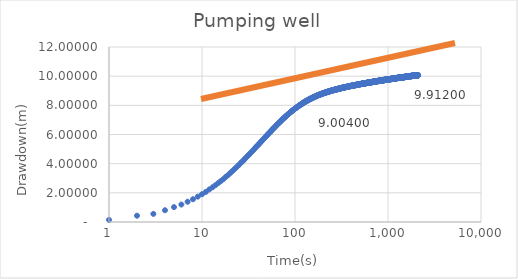
| Category | Series 0 |
|---|---|
| 1.0 | 0.147 |
| 2.0 | 0.43 |
| 3.0 | 0.557 |
| 4.0 | 0.806 |
| 5.0 | 1.02 |
| 6.0 | 1.198 |
| 7.0 | 1.389 |
| 8.0 | 1.561 |
| 9.0 | 1.739 |
| 10.0 | 1.904 |
| 11.0 | 2.062 |
| 12.0 | 2.236 |
| 13.0 | 2.383 |
| 14.0 | 2.53 |
| 15.0 | 2.679 |
| 16.0 | 2.816 |
| 17.0 | 2.945 |
| 18.0 | 3.09 |
| 19.0 | 3.211 |
| 20.0 | 3.342 |
| 21.0 | 3.468 |
| 22.0 | 3.584 |
| 23.0 | 3.702 |
| 24.0 | 3.816 |
| 25.0 | 3.92 |
| 26.0 | 4.038 |
| 27.0 | 4.137 |
| 28.0 | 4.228 |
| 29.0 | 4.341 |
| 30.0 | 4.44 |
| 31.0 | 4.529 |
| 32.0 | 4.618 |
| 33.0 | 4.705 |
| 34.0 | 4.795 |
| 35.0 | 4.876 |
| 36.0 | 4.965 |
| 37.0 | 5.046 |
| 38.0 | 5.131 |
| 39.0 | 5.204 |
| 40.0 | 5.272 |
| 41.0 | 5.35 |
| 42.0 | 5.427 |
| 43.0 | 5.492 |
| 44.0 | 5.569 |
| 45.0 | 5.629 |
| 46.0 | 5.699 |
| 47.0 | 5.764 |
| 48.0 | 5.825 |
| 49.0 | 5.881 |
| 50.0 | 5.948 |
| 51.0 | 6.004 |
| 52.0 | 6.061 |
| 53.0 | 6.117 |
| 54.0 | 6.172 |
| 55.0 | 6.22 |
| 56.0 | 6.278 |
| 57.0 | 6.332 |
| 58.0 | 6.386 |
| 59.0 | 6.431 |
| 60.0 | 6.481 |
| 61.0 | 6.523 |
| 62.0 | 6.565 |
| 63.0 | 6.624 |
| 64.0 | 6.664 |
| 65.0 | 6.704 |
| 66.0 | 6.753 |
| 67.0 | 6.784 |
| 68.0 | 6.828 |
| 69.0 | 6.874 |
| 70.0 | 6.901 |
| 71.0 | 6.939 |
| 72.0 | 6.988 |
| 73.0 | 7.023 |
| 74.0 | 7.059 |
| 75.0 | 7.094 |
| 76.0 | 7.126 |
| 77.0 | 7.164 |
| 78.0 | 7.185 |
| 79.0 | 7.215 |
| 80.0 | 7.263 |
| 81.0 | 7.294 |
| 82.0 | 7.308 |
| 83.0 | 7.347 |
| 84.0 | 7.387 |
| 85.0 | 7.396 |
| 86.0 | 7.433 |
| 87.0 | 7.465 |
| 88.0 | 7.478 |
| 89.0 | 7.521 |
| 90.0 | 7.537 |
| 91.0 | 7.557 |
| 92.0 | 7.598 |
| 93.0 | 7.618 |
| 94.0 | 7.639 |
| 95.0 | 7.664 |
| 96.0 | 7.693 |
| 97.0 | 7.699 |
| 98.0 | 7.723 |
| 99.0 | 7.76 |
| 100.0 | 7.77 |
| 101.0 | 7.797 |
| 102.0 | 7.821 |
| 103.0 | 7.82 |
| 104.0 | 7.85 |
| 105.0 | 7.88 |
| 106.0 | 7.887 |
| 107.0 | 7.905 |
| 108.0 | 7.936 |
| 109.0 | 7.943 |
| 110.0 | 7.967 |
| 111.0 | 7.996 |
| 112.0 | 7.993 |
| 113.0 | 8.001 |
| 114.0 | 8.04 |
| 115.0 | 8.047 |
| 116.0 | 8.055 |
| 117.0 | 8.093 |
| 118.0 | 8.09 |
| 119.0 | 8.096 |
| 120.0 | 8.131 |
| 121.0 | 8.153 |
| 122.0 | 8.147 |
| 123.0 | 8.172 |
| 124.0 | 8.206 |
| 125.0 | 8.187 |
| 126.0 | 8.205 |
| 127.0 | 8.24 |
| 128.0 | 8.243 |
| 129.0 | 8.257 |
| 130.0 | 8.279 |
| 131.0 | 8.259 |
| 132.0 | 8.276 |
| 133.0 | 8.319 |
| 134.0 | 8.314 |
| 135.0 | 8.31 |
| 136.0 | 8.347 |
| 137.0 | 8.346 |
| 138.0 | 8.338 |
| 139.0 | 8.372 |
| 140.0 | 8.394 |
| 141.0 | 8.376 |
| 142.0 | 8.402 |
| 143.0 | 8.427 |
| 144.0 | 8.412 |
| 145.0 | 8.42 |
| 146.0 | 8.461 |
| 147.0 | 8.455 |
| 148.0 | 8.438 |
| 149.0 | 8.476 |
| 150.0 | 8.484 |
| 151.0 | 8.475 |
| 152.0 | 8.493 |
| 153.0 | 8.521 |
| 154.0 | 8.504 |
| 155.0 | 8.515 |
| 156.0 | 8.55 |
| 157.0 | 8.54 |
| 158.0 | 8.535 |
| 159.0 | 8.566 |
| 160.0 | 8.563 |
| 161.0 | 8.553 |
| 162.0 | 8.59 |
| 163.0 | 8.599 |
| 164.0 | 8.578 |
| 165.0 | 8.607 |
| 166.0 | 8.625 |
| 167.0 | 8.608 |
| 168.0 | 8.62 |
| 169.0 | 8.65 |
| 170.0 | 8.631 |
| 171.0 | 8.635 |
| 172.0 | 8.668 |
| 173.0 | 8.663 |
| 174.0 | 8.661 |
| 175.0 | 8.691 |
| 176.0 | 8.687 |
| 177.0 | 8.679 |
| 178.0 | 8.698 |
| 179.0 | 8.713 |
| 180.0 | 8.71 |
| 181.0 | 8.709 |
| 182.0 | 8.728 |
| 183.0 | 8.715 |
| 184.0 | 8.717 |
| 185.0 | 8.752 |
| 186.0 | 8.758 |
| 187.0 | 8.733 |
| 188.0 | 8.749 |
| 189.0 | 8.768 |
| 190.0 | 8.768 |
| 191.0 | 8.767 |
| 192.0 | 8.786 |
| 193.0 | 8.775 |
| 194.0 | 8.774 |
| 195.0 | 8.801 |
| 196.0 | 8.804 |
| 197.0 | 8.794 |
| 198.0 | 8.821 |
| 199.0 | 8.826 |
| 200.0 | 8.805 |
| 201.0 | 8.81 |
| 202.0 | 8.845 |
| 203.0 | 8.838 |
| 204.0 | 8.83 |
| 205.0 | 8.846 |
| 206.0 | 8.846 |
| 207.0 | 8.848 |
| 208.0 | 8.854 |
| 209.0 | 8.876 |
| 210.0 | 8.864 |
| 211.0 | 8.862 |
| 212.0 | 8.88 |
| 213.0 | 8.877 |
| 214.0 | 8.876 |
| 215.0 | 8.881 |
| 216.0 | 8.906 |
| 217.0 | 8.903 |
| 218.0 | 8.889 |
| 219.0 | 8.916 |
| 220.0 | 8.919 |
| 221.0 | 8.897 |
| 222.0 | 8.91 |
| 223.0 | 8.935 |
| 224.0 | 8.932 |
| 225.0 | 8.912 |
| 226.0 | 8.931 |
| 227.0 | 8.94 |
| 228.0 | 8.928 |
| 229.0 | 8.94 |
| 230.0 | 8.954 |
| 231.0 | 8.956 |
| 232.0 | 8.951 |
| 233.0 | 8.954 |
| 234.0 | 8.971 |
| 235.0 | 8.957 |
| 236.0 | 8.96 |
| 237.0 | 8.985 |
| 238.0 | 8.985 |
| 239.0 | 8.972 |
| 240.0 | 8.97 |
| 241.0 | 8.989 |
| 242.0 | 8.987 |
| 243.0 | 8.986 |
| 244.0 | 8.994 |
| 245.0 | 9.001 |
| 246.0 | 9.004 |
| 247.0 | 9.002 |
| 248.0 | 9.015 |
| 249.0 | 9.027 |
| 250.0 | 9.004 |
| 251.0 | 9.015 |
| 252.0 | 9.034 |
| 253.0 | 9.023 |
| 254.0 | 9.027 |
| 255.0 | 9.028 |
| 256.0 | 9.042 |
| 257.0 | 9.032 |
| 258.0 | 9.024 |
| 259.0 | 9.051 |
| 260.0 | 9.053 |
| 261.0 | 9.037 |
| 262.0 | 9.042 |
| 263.0 | 9.056 |
| 264.0 | 9.055 |
| 265.0 | 9.053 |
| 266.0 | 9.067 |
| 267.0 | 9.077 |
| 268.0 | 9.072 |
| 269.0 | 9.054 |
| 270.0 | 9.085 |
| 271.0 | 9.088 |
| 272.0 | 9.069 |
| 273.0 | 9.07 |
| 274.0 | 9.095 |
| 275.0 | 9.084 |
| 276.0 | 9.079 |
| 277.0 | 9.09 |
| 278.0 | 9.109 |
| 279.0 | 9.099 |
| 280.0 | 9.088 |
| 281.0 | 9.104 |
| 282.0 | 9.111 |
| 283.0 | 9.099 |
| 284.0 | 9.104 |
| 285.0 | 9.121 |
| 286.0 | 9.128 |
| 287.0 | 9.109 |
| 288.0 | 9.108 |
| 289.0 | 9.133 |
| 290.0 | 9.131 |
| 291.0 | 9.123 |
| 292.0 | 9.111 |
| 293.0 | 9.139 |
| 294.0 | 9.142 |
| 295.0 | 9.124 |
| 296.0 | 9.13 |
| 297.0 | 9.155 |
| 298.0 | 9.152 |
| 299.0 | 9.14 |
| 300.0 | 9.146 |
| 301.0 | 9.162 |
| 302.0 | 9.154 |
| 303.0 | 9.149 |
| 304.0 | 9.156 |
| 305.0 | 9.166 |
| 306.0 | 9.161 |
| 307.0 | 9.16 |
| 308.0 | 9.169 |
| 309.0 | 9.174 |
| 310.0 | 9.168 |
| 311.0 | 9.163 |
| 312.0 | 9.178 |
| 313.0 | 9.178 |
| 314.0 | 9.17 |
| 315.0 | 9.174 |
| 316.0 | 9.191 |
| 317.0 | 9.195 |
| 318.0 | 9.188 |
| 319.0 | 9.192 |
| 320.0 | 9.201 |
| 321.0 | 9.186 |
| 322.0 | 9.188 |
| 323.0 | 9.208 |
| 324.0 | 9.215 |
| 325.0 | 9.196 |
| 326.0 | 9.201 |
| 327.0 | 9.213 |
| 328.0 | 9.222 |
| 329.0 | 9.208 |
| 330.0 | 9.199 |
| 331.0 | 9.227 |
| 332.0 | 9.22 |
| 333.0 | 9.215 |
| 334.0 | 9.209 |
| 335.0 | 9.233 |
| 336.0 | 9.218 |
| 337.0 | 9.212 |
| 338.0 | 9.236 |
| 339.0 | 9.24 |
| 340.0 | 9.224 |
| 341.0 | 9.222 |
| 342.0 | 9.24 |
| 343.0 | 9.248 |
| 344.0 | 9.229 |
| 345.0 | 9.225 |
| 346.0 | 9.256 |
| 347.0 | 9.246 |
| 348.0 | 9.236 |
| 349.0 | 9.243 |
| 350.0 | 9.253 |
| 351.0 | 9.254 |
| 352.0 | 9.248 |
| 353.0 | 9.254 |
| 354.0 | 9.266 |
| 355.0 | 9.258 |
| 356.0 | 9.254 |
| 357.0 | 9.264 |
| 358.0 | 9.264 |
| 359.0 | 9.262 |
| 360.0 | 9.253 |
| 361.0 | 9.274 |
| 362.0 | 9.279 |
| 363.0 | 9.27 |
| 364.0 | 9.266 |
| 365.0 | 9.284 |
| 366.0 | 9.282 |
| 367.0 | 9.269 |
| 368.0 | 9.263 |
| 369.0 | 9.29 |
| 370.0 | 9.283 |
| 371.0 | 9.282 |
| 372.0 | 9.274 |
| 373.0 | 9.295 |
| 374.0 | 9.296 |
| 375.0 | 9.283 |
| 376.0 | 9.286 |
| 377.0 | 9.301 |
| 378.0 | 9.308 |
| 379.0 | 9.294 |
| 380.0 | 9.299 |
| 381.0 | 9.315 |
| 382.0 | 9.315 |
| 383.0 | 9.302 |
| 384.0 | 9.308 |
| 385.0 | 9.324 |
| 386.0 | 9.314 |
| 387.0 | 9.298 |
| 388.0 | 9.31 |
| 389.0 | 9.318 |
| 390.0 | 9.317 |
| 391.0 | 9.308 |
| 392.0 | 9.322 |
| 393.0 | 9.325 |
| 394.0 | 9.325 |
| 395.0 | 9.318 |
| 396.0 | 9.318 |
| 397.0 | 9.333 |
| 398.0 | 9.338 |
| 399.0 | 9.323 |
| 400.0 | 9.332 |
| 401.0 | 9.346 |
| 402.0 | 9.33 |
| 403.0 | 9.325 |
| 404.0 | 9.327 |
| 405.0 | 9.339 |
| 406.0 | 9.343 |
| 407.0 | 9.336 |
| 408.0 | 9.332 |
| 409.0 | 9.342 |
| 410.0 | 9.351 |
| 411.0 | 9.337 |
| 412.0 | 9.335 |
| 413.0 | 9.358 |
| 414.0 | 9.355 |
| 415.0 | 9.339 |
| 416.0 | 9.332 |
| 417.0 | 9.358 |
| 418.0 | 9.371 |
| 419.0 | 9.346 |
| 420.0 | 9.355 |
| 421.0 | 9.366 |
| 422.0 | 9.359 |
| 423.0 | 9.355 |
| 424.0 | 9.352 |
| 425.0 | 9.377 |
| 426.0 | 9.374 |
| 427.0 | 9.356 |
| 428.0 | 9.365 |
| 429.0 | 9.378 |
| 430.0 | 9.383 |
| 431.0 | 9.361 |
| 432.0 | 9.363 |
| 433.0 | 9.38 |
| 434.0 | 9.374 |
| 435.0 | 9.37 |
| 436.0 | 9.369 |
| 437.0 | 9.393 |
| 438.0 | 9.386 |
| 439.0 | 9.378 |
| 440.0 | 9.369 |
| 441.0 | 9.397 |
| 442.0 | 9.39 |
| 443.0 | 9.374 |
| 444.0 | 9.394 |
| 445.0 | 9.397 |
| 446.0 | 9.397 |
| 447.0 | 9.388 |
| 448.0 | 9.385 |
| 449.0 | 9.398 |
| 450.0 | 9.398 |
| 451.0 | 9.382 |
| 452.0 | 9.392 |
| 453.0 | 9.398 |
| 454.0 | 9.41 |
| 455.0 | 9.396 |
| 456.0 | 9.399 |
| 457.0 | 9.4 |
| 458.0 | 9.415 |
| 459.0 | 9.407 |
| 460.0 | 9.392 |
| 461.0 | 9.404 |
| 462.0 | 9.414 |
| 463.0 | 9.415 |
| 464.0 | 9.411 |
| 465.0 | 9.412 |
| 466.0 | 9.417 |
| 467.0 | 9.435 |
| 468.0 | 9.411 |
| 469.0 | 9.406 |
| 470.0 | 9.414 |
| 471.0 | 9.419 |
| 472.0 | 9.426 |
| 473.0 | 9.421 |
| 474.0 | 9.419 |
| 475.0 | 9.435 |
| 476.0 | 9.422 |
| 477.0 | 9.407 |
| 478.0 | 9.427 |
| 479.0 | 9.433 |
| 480.0 | 9.437 |
| 481.0 | 9.426 |
| 482.0 | 9.425 |
| 483.0 | 9.435 |
| 484.0 | 9.438 |
| 485.0 | 9.435 |
| 486.0 | 9.428 |
| 487.0 | 9.437 |
| 488.0 | 9.445 |
| 489.0 | 9.439 |
| 490.0 | 9.443 |
| 491.0 | 9.443 |
| 492.0 | 9.452 |
| 493.0 | 9.46 |
| 494.0 | 9.442 |
| 495.0 | 9.442 |
| 496.0 | 9.453 |
| 497.0 | 9.452 |
| 498.0 | 9.446 |
| 499.0 | 9.45 |
| 500.0 | 9.449 |
| 501.0 | 9.46 |
| 502.0 | 9.454 |
| 503.0 | 9.448 |
| 504.0 | 9.457 |
| 505.0 | 9.458 |
| 506.0 | 9.453 |
| 507.0 | 9.455 |
| 508.0 | 9.453 |
| 509.0 | 9.466 |
| 510.0 | 9.465 |
| 511.0 | 9.458 |
| 512.0 | 9.455 |
| 513.0 | 9.47 |
| 514.0 | 9.471 |
| 515.0 | 9.465 |
| 516.0 | 9.456 |
| 517.0 | 9.476 |
| 518.0 | 9.477 |
| 519.0 | 9.46 |
| 520.0 | 9.457 |
| 521.0 | 9.47 |
| 522.0 | 9.481 |
| 523.0 | 9.475 |
| 524.0 | 9.462 |
| 525.0 | 9.478 |
| 526.0 | 9.495 |
| 527.0 | 9.487 |
| 528.0 | 9.474 |
| 529.0 | 9.475 |
| 530.0 | 9.482 |
| 531.0 | 9.489 |
| 532.0 | 9.483 |
| 533.0 | 9.48 |
| 534.0 | 9.491 |
| 535.0 | 9.495 |
| 536.0 | 9.487 |
| 537.0 | 9.482 |
| 538.0 | 9.494 |
| 539.0 | 9.492 |
| 540.0 | 9.497 |
| 541.0 | 9.486 |
| 542.0 | 9.479 |
| 543.0 | 9.495 |
| 544.0 | 9.502 |
| 545.0 | 9.503 |
| 546.0 | 9.485 |
| 547.0 | 9.5 |
| 548.0 | 9.504 |
| 549.0 | 9.505 |
| 550.0 | 9.49 |
| 551.0 | 9.487 |
| 552.0 | 9.51 |
| 553.0 | 9.513 |
| 554.0 | 9.508 |
| 555.0 | 9.499 |
| 556.0 | 9.512 |
| 557.0 | 9.52 |
| 558.0 | 9.509 |
| 559.0 | 9.505 |
| 560.0 | 9.513 |
| 561.0 | 9.518 |
| 562.0 | 9.502 |
| 563.0 | 9.499 |
| 564.0 | 9.514 |
| 565.0 | 9.519 |
| 566.0 | 9.511 |
| 567.0 | 9.513 |
| 568.0 | 9.505 |
| 569.0 | 9.518 |
| 570.0 | 9.528 |
| 571.0 | 9.509 |
| 572.0 | 9.514 |
| 573.0 | 9.52 |
| 574.0 | 9.531 |
| 575.0 | 9.518 |
| 576.0 | 9.513 |
| 577.0 | 9.529 |
| 578.0 | 9.527 |
| 579.0 | 9.526 |
| 580.0 | 9.53 |
| 581.0 | 9.525 |
| 582.0 | 9.531 |
| 583.0 | 9.531 |
| 584.0 | 9.524 |
| 585.0 | 9.516 |
| 586.0 | 9.531 |
| 587.0 | 9.541 |
| 588.0 | 9.534 |
| 589.0 | 9.529 |
| 590.0 | 9.526 |
| 591.0 | 9.543 |
| 592.0 | 9.549 |
| 593.0 | 9.526 |
| 594.0 | 9.532 |
| 595.0 | 9.538 |
| 596.0 | 9.546 |
| 597.0 | 9.542 |
| 598.0 | 9.534 |
| 599.0 | 9.538 |
| 600.0 | 9.552 |
| 601.0 | 9.546 |
| 602.0 | 9.537 |
| 603.0 | 9.53 |
| 604.0 | 9.549 |
| 605.0 | 9.56 |
| 606.0 | 9.547 |
| 607.0 | 9.544 |
| 608.0 | 9.542 |
| 609.0 | 9.563 |
| 610.0 | 9.556 |
| 611.0 | 9.544 |
| 612.0 | 9.546 |
| 613.0 | 9.558 |
| 614.0 | 9.566 |
| 615.0 | 9.546 |
| 616.0 | 9.543 |
| 617.0 | 9.552 |
| 618.0 | 9.565 |
| 619.0 | 9.564 |
| 620.0 | 9.551 |
| 621.0 | 9.56 |
| 622.0 | 9.565 |
| 623.0 | 9.575 |
| 624.0 | 9.562 |
| 625.0 | 9.558 |
| 626.0 | 9.573 |
| 627.0 | 9.575 |
| 628.0 | 9.557 |
| 629.0 | 9.556 |
| 630.0 | 9.575 |
| 631.0 | 9.57 |
| 632.0 | 9.568 |
| 633.0 | 9.555 |
| 634.0 | 9.564 |
| 635.0 | 9.579 |
| 636.0 | 9.573 |
| 637.0 | 9.559 |
| 638.0 | 9.559 |
| 639.0 | 9.574 |
| 640.0 | 9.579 |
| 641.0 | 9.578 |
| 642.0 | 9.562 |
| 643.0 | 9.576 |
| 644.0 | 9.582 |
| 645.0 | 9.592 |
| 646.0 | 9.57 |
| 647.0 | 9.566 |
| 648.0 | 9.582 |
| 649.0 | 9.585 |
| 650.0 | 9.584 |
| 651.0 | 9.57 |
| 652.0 | 9.569 |
| 653.0 | 9.591 |
| 654.0 | 9.59 |
| 655.0 | 9.576 |
| 656.0 | 9.577 |
| 657.0 | 9.587 |
| 658.0 | 9.604 |
| 659.0 | 9.581 |
| 660.0 | 9.577 |
| 661.0 | 9.586 |
| 662.0 | 9.589 |
| 663.0 | 9.607 |
| 664.0 | 9.588 |
| 665.0 | 9.582 |
| 666.0 | 9.6 |
| 667.0 | 9.595 |
| 668.0 | 9.589 |
| 669.0 | 9.586 |
| 670.0 | 9.59 |
| 671.0 | 9.601 |
| 672.0 | 9.598 |
| 673.0 | 9.585 |
| 674.0 | 9.588 |
| 675.0 | 9.608 |
| 676.0 | 9.604 |
| 677.0 | 9.601 |
| 678.0 | 9.595 |
| 679.0 | 9.611 |
| 680.0 | 9.607 |
| 681.0 | 9.596 |
| 682.0 | 9.595 |
| 683.0 | 9.604 |
| 684.0 | 9.614 |
| 685.0 | 9.608 |
| 686.0 | 9.601 |
| 687.0 | 9.61 |
| 688.0 | 9.613 |
| 689.0 | 9.614 |
| 690.0 | 9.601 |
| 691.0 | 9.61 |
| 692.0 | 9.622 |
| 693.0 | 9.618 |
| 694.0 | 9.609 |
| 695.0 | 9.614 |
| 696.0 | 9.621 |
| 697.0 | 9.629 |
| 698.0 | 9.614 |
| 699.0 | 9.612 |
| 700.0 | 9.607 |
| 701.0 | 9.627 |
| 702.0 | 9.62 |
| 703.0 | 9.608 |
| 704.0 | 9.615 |
| 705.0 | 9.636 |
| 706.0 | 9.631 |
| 707.0 | 9.622 |
| 708.0 | 9.607 |
| 709.0 | 9.616 |
| 710.0 | 9.634 |
| 711.0 | 9.634 |
| 712.0 | 9.618 |
| 713.0 | 9.624 |
| 714.0 | 9.634 |
| 715.0 | 9.628 |
| 716.0 | 9.62 |
| 717.0 | 9.62 |
| 718.0 | 9.635 |
| 719.0 | 9.638 |
| 720.0 | 9.628 |
| 721.0 | 9.616 |
| 722.0 | 9.623 |
| 723.0 | 9.646 |
| 724.0 | 9.642 |
| 725.0 | 9.619 |
| 726.0 | 9.625 |
| 727.0 | 9.642 |
| 728.0 | 9.641 |
| 729.0 | 9.627 |
| 730.0 | 9.624 |
| 731.0 | 9.639 |
| 732.0 | 9.655 |
| 733.0 | 9.649 |
| 734.0 | 9.633 |
| 735.0 | 9.643 |
| 736.0 | 9.645 |
| 737.0 | 9.647 |
| 738.0 | 9.635 |
| 739.0 | 9.628 |
| 740.0 | 9.643 |
| 741.0 | 9.66 |
| 742.0 | 9.649 |
| 743.0 | 9.636 |
| 744.0 | 9.647 |
| 745.0 | 9.653 |
| 746.0 | 9.65 |
| 747.0 | 9.636 |
| 748.0 | 9.642 |
| 749.0 | 9.653 |
| 750.0 | 9.657 |
| 751.0 | 9.647 |
| 752.0 | 9.642 |
| 753.0 | 9.658 |
| 754.0 | 9.656 |
| 755.0 | 9.652 |
| 756.0 | 9.654 |
| 757.0 | 9.654 |
| 758.0 | 9.671 |
| 759.0 | 9.66 |
| 760.0 | 9.639 |
| 761.0 | 9.652 |
| 762.0 | 9.664 |
| 763.0 | 9.659 |
| 764.0 | 9.658 |
| 765.0 | 9.653 |
| 766.0 | 9.664 |
| 767.0 | 9.67 |
| 768.0 | 9.657 |
| 769.0 | 9.647 |
| 770.0 | 9.662 |
| 771.0 | 9.668 |
| 772.0 | 9.662 |
| 773.0 | 9.657 |
| 774.0 | 9.657 |
| 775.0 | 9.673 |
| 776.0 | 9.672 |
| 777.0 | 9.662 |
| 778.0 | 9.665 |
| 779.0 | 9.671 |
| 780.0 | 9.68 |
| 781.0 | 9.666 |
| 782.0 | 9.665 |
| 783.0 | 9.663 |
| 784.0 | 9.678 |
| 785.0 | 9.672 |
| 786.0 | 9.666 |
| 787.0 | 9.664 |
| 788.0 | 9.674 |
| 789.0 | 9.68 |
| 790.0 | 9.673 |
| 791.0 | 9.662 |
| 792.0 | 9.68 |
| 793.0 | 9.682 |
| 794.0 | 9.678 |
| 795.0 | 9.667 |
| 796.0 | 9.67 |
| 797.0 | 9.68 |
| 798.0 | 9.684 |
| 799.0 | 9.674 |
| 800.0 | 9.664 |
| 801.0 | 9.692 |
| 802.0 | 9.686 |
| 803.0 | 9.673 |
| 804.0 | 9.67 |
| 805.0 | 9.681 |
| 806.0 | 9.703 |
| 807.0 | 9.682 |
| 808.0 | 9.672 |
| 809.0 | 9.689 |
| 810.0 | 9.697 |
| 811.0 | 9.696 |
| 812.0 | 9.675 |
| 813.0 | 9.677 |
| 814.0 | 9.69 |
| 815.0 | 9.69 |
| 816.0 | 9.678 |
| 817.0 | 9.678 |
| 818.0 | 9.695 |
| 819.0 | 9.694 |
| 820.0 | 9.694 |
| 821.0 | 9.685 |
| 822.0 | 9.695 |
| 823.0 | 9.697 |
| 824.0 | 9.704 |
| 825.0 | 9.693 |
| 826.0 | 9.688 |
| 827.0 | 9.704 |
| 828.0 | 9.705 |
| 829.0 | 9.688 |
| 830.0 | 9.683 |
| 831.0 | 9.694 |
| 832.0 | 9.716 |
| 833.0 | 9.708 |
| 834.0 | 9.69 |
| 835.0 | 9.695 |
| 836.0 | 9.708 |
| 837.0 | 9.713 |
| 838.0 | 9.696 |
| 839.0 | 9.692 |
| 840.0 | 9.708 |
| 841.0 | 9.707 |
| 842.0 | 9.704 |
| 843.0 | 9.693 |
| 844.0 | 9.693 |
| 845.0 | 9.711 |
| 846.0 | 9.71 |
| 847.0 | 9.692 |
| 848.0 | 9.696 |
| 849.0 | 9.703 |
| 850.0 | 9.716 |
| 851.0 | 9.707 |
| 852.0 | 9.7 |
| 853.0 | 9.705 |
| 854.0 | 9.72 |
| 855.0 | 9.719 |
| 856.0 | 9.707 |
| 857.0 | 9.705 |
| 858.0 | 9.719 |
| 859.0 | 9.714 |
| 860.0 | 9.7 |
| 861.0 | 9.701 |
| 862.0 | 9.719 |
| 863.0 | 9.725 |
| 864.0 | 9.71 |
| 865.0 | 9.704 |
| 866.0 | 9.71 |
| 867.0 | 9.715 |
| 868.0 | 9.716 |
| 869.0 | 9.699 |
| 870.0 | 9.716 |
| 871.0 | 9.723 |
| 872.0 | 9.719 |
| 873.0 | 9.709 |
| 874.0 | 9.719 |
| 875.0 | 9.728 |
| 876.0 | 9.721 |
| 877.0 | 9.715 |
| 878.0 | 9.719 |
| 879.0 | 9.727 |
| 880.0 | 9.722 |
| 881.0 | 9.714 |
| 882.0 | 9.712 |
| 883.0 | 9.732 |
| 884.0 | 9.734 |
| 885.0 | 9.721 |
| 886.0 | 9.708 |
| 887.0 | 9.721 |
| 888.0 | 9.74 |
| 889.0 | 9.728 |
| 890.0 | 9.714 |
| 891.0 | 9.728 |
| 892.0 | 9.734 |
| 893.0 | 9.732 |
| 894.0 | 9.722 |
| 895.0 | 9.718 |
| 896.0 | 9.738 |
| 897.0 | 9.75 |
| 898.0 | 9.733 |
| 899.0 | 9.725 |
| 900.0 | 9.737 |
| 901.0 | 9.739 |
| 902.0 | 9.731 |
| 903.0 | 9.711 |
| 904.0 | 9.732 |
| 905.0 | 9.749 |
| 906.0 | 9.737 |
| 907.0 | 9.733 |
| 908.0 | 9.731 |
| 909.0 | 9.742 |
| 910.0 | 9.742 |
| 911.0 | 9.726 |
| 912.0 | 9.722 |
| 913.0 | 9.746 |
| 914.0 | 9.751 |
| 915.0 | 9.735 |
| 916.0 | 9.731 |
| 917.0 | 9.741 |
| 918.0 | 9.752 |
| 919.0 | 9.746 |
| 920.0 | 9.728 |
| 921.0 | 9.748 |
| 922.0 | 9.744 |
| 923.0 | 9.741 |
| 924.0 | 9.74 |
| 925.0 | 9.733 |
| 926.0 | 9.746 |
| 927.0 | 9.758 |
| 928.0 | 9.742 |
| 929.0 | 9.738 |
| 930.0 | 9.748 |
| 931.0 | 9.754 |
| 932.0 | 9.751 |
| 933.0 | 9.742 |
| 934.0 | 9.742 |
| 935.0 | 9.749 |
| 936.0 | 9.761 |
| 937.0 | 9.745 |
| 938.0 | 9.735 |
| 939.0 | 9.74 |
| 940.0 | 9.759 |
| 941.0 | 9.757 |
| 942.0 | 9.747 |
| 943.0 | 9.74 |
| 944.0 | 9.758 |
| 945.0 | 9.763 |
| 946.0 | 9.753 |
| 947.0 | 9.739 |
| 948.0 | 9.749 |
| 949.0 | 9.764 |
| 950.0 | 9.767 |
| 951.0 | 9.744 |
| 952.0 | 9.744 |
| 953.0 | 9.764 |
| 954.0 | 9.771 |
| 955.0 | 9.757 |
| 956.0 | 9.748 |
| 957.0 | 9.747 |
| 958.0 | 9.758 |
| 959.0 | 9.766 |
| 960.0 | 9.751 |
| 961.0 | 9.749 |
| 962.0 | 9.764 |
| 963.0 | 9.77 |
| 964.0 | 9.768 |
| 965.0 | 9.754 |
| 966.0 | 9.75 |
| 967.0 | 9.763 |
| 968.0 | 9.769 |
| 969.0 | 9.764 |
| 970.0 | 9.753 |
| 971.0 | 9.761 |
| 972.0 | 9.77 |
| 973.0 | 9.763 |
| 974.0 | 9.757 |
| 975.0 | 9.75 |
| 976.0 | 9.771 |
| 977.0 | 9.776 |
| 978.0 | 9.764 |
| 979.0 | 9.765 |
| 980.0 | 9.763 |
| 981.0 | 9.777 |
| 982.0 | 9.772 |
| 983.0 | 9.765 |
| 984.0 | 9.761 |
| 985.0 | 9.785 |
| 986.0 | 9.773 |
| 987.0 | 9.763 |
| 988.0 | 9.76 |
| 989.0 | 9.768 |
| 990.0 | 9.782 |
| 991.0 | 9.773 |
| 992.0 | 9.766 |
| 993.0 | 9.771 |
| 994.0 | 9.776 |
| 995.0 | 9.772 |
| 996.0 | 9.77 |
| 997.0 | 9.773 |
| 998.0 | 9.782 |
| 999.0 | 9.783 |
| 1000.0 | 9.778 |
| 1001.0 | 9.769 |
| 1002.0 | 9.783 |
| 1003.0 | 9.786 |
| 1004.0 | 9.779 |
| 1005.0 | 9.768 |
| 1006.0 | 9.777 |
| 1007.0 | 9.79 |
| 1008.0 | 9.792 |
| 1009.0 | 9.776 |
| 1010.0 | 9.778 |
| 1011.0 | 9.791 |
| 1012.0 | 9.795 |
| 1013.0 | 9.772 |
| 1014.0 | 9.777 |
| 1015.0 | 9.792 |
| 1016.0 | 9.786 |
| 1017.0 | 9.781 |
| 1018.0 | 9.77 |
| 1019.0 | 9.779 |
| 1020.0 | 9.795 |
| 1021.0 | 9.796 |
| 1022.0 | 9.782 |
| 1023.0 | 9.775 |
| 1024.0 | 9.797 |
| 1025.0 | 9.802 |
| 1026.0 | 9.784 |
| 1027.0 | 9.772 |
| 1028.0 | 9.796 |
| 1029.0 | 9.803 |
| 1030.0 | 9.793 |
| 1031.0 | 9.781 |
| 1032.0 | 9.79 |
| 1033.0 | 9.8 |
| 1034.0 | 9.798 |
| 1035.0 | 9.786 |
| 1036.0 | 9.78 |
| 1037.0 | 9.8 |
| 1038.0 | 9.793 |
| 1039.0 | 9.785 |
| 1040.0 | 9.782 |
| 1041.0 | 9.797 |
| 1042.0 | 9.796 |
| 1043.0 | 9.8 |
| 1044.0 | 9.787 |
| 1045.0 | 9.795 |
| 1046.0 | 9.804 |
| 1047.0 | 9.803 |
| 1048.0 | 9.792 |
| 1049.0 | 9.795 |
| 1050.0 | 9.805 |
| 1051.0 | 9.8 |
| 1052.0 | 9.798 |
| 1053.0 | 9.792 |
| 1054.0 | 9.798 |
| 1055.0 | 9.803 |
| 1056.0 | 9.81 |
| 1057.0 | 9.792 |
| 1058.0 | 9.79 |
| 1059.0 | 9.8 |
| 1060.0 | 9.811 |
| 1061.0 | 9.808 |
| 1062.0 | 9.797 |
| 1063.0 | 9.786 |
| 1064.0 | 9.798 |
| 1065.0 | 9.809 |
| 1066.0 | 9.804 |
| 1067.0 | 9.798 |
| 1068.0 | 9.795 |
| 1069.0 | 9.797 |
| 1070.0 | 9.818 |
| 1071.0 | 9.798 |
| 1072.0 | 9.797 |
| 1073.0 | 9.801 |
| 1074.0 | 9.815 |
| 1075.0 | 9.807 |
| 1076.0 | 9.796 |
| 1077.0 | 9.792 |
| 1078.0 | 9.811 |
| 1079.0 | 9.822 |
| 1080.0 | 9.813 |
| 1081.0 | 9.801 |
| 1082.0 | 9.797 |
| 1083.0 | 9.804 |
| 1084.0 | 9.812 |
| 1085.0 | 9.811 |
| 1086.0 | 9.807 |
| 1087.0 | 9.802 |
| 1088.0 | 9.817 |
| 1089.0 | 9.824 |
| 1090.0 | 9.804 |
| 1091.0 | 9.799 |
| 1092.0 | 9.807 |
| 1093.0 | 9.812 |
| 1094.0 | 9.818 |
| 1095.0 | 9.808 |
| 1096.0 | 9.803 |
| 1097.0 | 9.816 |
| 1098.0 | 9.815 |
| 1099.0 | 9.815 |
| 1100.0 | 9.81 |
| 1101.0 | 9.805 |
| 1102.0 | 9.82 |
| 1103.0 | 9.829 |
| 1104.0 | 9.819 |
| 1105.0 | 9.807 |
| 1106.0 | 9.812 |
| 1107.0 | 9.826 |
| 1108.0 | 9.825 |
| 1109.0 | 9.812 |
| 1110.0 | 9.812 |
| 1111.0 | 9.82 |
| 1112.0 | 9.827 |
| 1113.0 | 9.821 |
| 1114.0 | 9.808 |
| 1115.0 | 9.806 |
| 1116.0 | 9.831 |
| 1117.0 | 9.826 |
| 1118.0 | 9.816 |
| 1119.0 | 9.813 |
| 1120.0 | 9.827 |
| 1121.0 | 9.835 |
| 1122.0 | 9.819 |
| 1123.0 | 9.812 |
| 1124.0 | 9.825 |
| 1125.0 | 9.832 |
| 1126.0 | 9.819 |
| 1127.0 | 9.82 |
| 1128.0 | 9.815 |
| 1129.0 | 9.837 |
| 1130.0 | 9.835 |
| 1131.0 | 9.818 |
| 1132.0 | 9.826 |
| 1133.0 | 9.838 |
| 1134.0 | 9.834 |
| 1135.0 | 9.829 |
| 1136.0 | 9.82 |
| 1137.0 | 9.829 |
| 1138.0 | 9.832 |
| 1139.0 | 9.835 |
| 1140.0 | 9.829 |
| 1141.0 | 9.824 |
| 1142.0 | 9.839 |
| 1143.0 | 9.844 |
| 1144.0 | 9.827 |
| 1145.0 | 9.824 |
| 1146.0 | 9.839 |
| 1147.0 | 9.847 |
| 1148.0 | 9.837 |
| 1149.0 | 9.819 |
| 1150.0 | 9.827 |
| 1151.0 | 9.845 |
| 1152.0 | 9.842 |
| 1153.0 | 9.832 |
| 1154.0 | 9.82 |
| 1155.0 | 9.832 |
| 1156.0 | 9.844 |
| 1157.0 | 9.838 |
| 1158.0 | 9.829 |
| 1159.0 | 9.83 |
| 1160.0 | 9.849 |
| 1161.0 | 9.842 |
| 1162.0 | 9.826 |
| 1163.0 | 9.828 |
| 1164.0 | 9.846 |
| 1165.0 | 9.856 |
| 1166.0 | 9.833 |
| 1167.0 | 9.834 |
| 1168.0 | 9.836 |
| 1169.0 | 9.851 |
| 1170.0 | 9.844 |
| 1171.0 | 9.835 |
| 1172.0 | 9.831 |
| 1173.0 | 9.858 |
| 1174.0 | 9.851 |
| 1175.0 | 9.834 |
| 1176.0 | 9.834 |
| 1177.0 | 9.856 |
| 1178.0 | 9.85 |
| 1179.0 | 9.846 |
| 1180.0 | 9.836 |
| 1181.0 | 9.847 |
| 1182.0 | 9.852 |
| 1183.0 | 9.863 |
| 1184.0 | 9.842 |
| 1185.0 | 9.837 |
| 1186.0 | 9.845 |
| 1187.0 | 9.852 |
| 1188.0 | 9.852 |
| 1189.0 | 9.843 |
| 1190.0 | 9.836 |
| 1191.0 | 9.852 |
| 1192.0 | 9.852 |
| 1193.0 | 9.849 |
| 1194.0 | 9.853 |
| 1195.0 | 9.845 |
| 1196.0 | 9.864 |
| 1197.0 | 9.855 |
| 1198.0 | 9.84 |
| 1199.0 | 9.847 |
| 1200.0 | 9.861 |
| 1201.0 | 9.856 |
| 1202.0 | 9.849 |
| 1203.0 | 9.845 |
| 1204.0 | 9.853 |
| 1205.0 | 9.864 |
| 1206.0 | 9.847 |
| 1207.0 | 9.85 |
| 1208.0 | 9.86 |
| 1209.0 | 9.862 |
| 1210.0 | 9.858 |
| 1211.0 | 9.849 |
| 1212.0 | 9.852 |
| 1213.0 | 9.867 |
| 1214.0 | 9.862 |
| 1215.0 | 9.857 |
| 1216.0 | 9.863 |
| 1217.0 | 9.867 |
| 1218.0 | 9.866 |
| 1219.0 | 9.849 |
| 1220.0 | 9.86 |
| 1221.0 | 9.857 |
| 1222.0 | 9.86 |
| 1223.0 | 9.861 |
| 1224.0 | 9.852 |
| 1225.0 | 9.863 |
| 1226.0 | 9.871 |
| 1227.0 | 9.861 |
| 1228.0 | 9.856 |
| 1229.0 | 9.853 |
| 1230.0 | 9.874 |
| 1231.0 | 9.862 |
| 1232.0 | 9.856 |
| 1233.0 | 9.85 |
| 1234.0 | 9.868 |
| 1235.0 | 9.868 |
| 1236.0 | 9.865 |
| 1237.0 | 9.868 |
| 1238.0 | 9.869 |
| 1239.0 | 9.874 |
| 1240.0 | 9.86 |
| 1241.0 | 9.862 |
| 1242.0 | 9.872 |
| 1243.0 | 9.874 |
| 1244.0 | 9.87 |
| 1245.0 | 9.856 |
| 1246.0 | 9.865 |
| 1247.0 | 9.878 |
| 1248.0 | 9.873 |
| 1249.0 | 9.862 |
| 1250.0 | 9.861 |
| 1251.0 | 9.877 |
| 1252.0 | 9.873 |
| 1253.0 | 9.865 |
| 1254.0 | 9.871 |
| 1255.0 | 9.882 |
| 1256.0 | 9.876 |
| 1257.0 | 9.871 |
| 1258.0 | 9.874 |
| 1259.0 | 9.874 |
| 1260.0 | 9.879 |
| 1261.0 | 9.875 |
| 1262.0 | 9.865 |
| 1263.0 | 9.882 |
| 1264.0 | 9.881 |
| 1265.0 | 9.877 |
| 1266.0 | 9.869 |
| 1267.0 | 9.879 |
| 1268.0 | 9.885 |
| 1269.0 | 9.877 |
| 1270.0 | 9.87 |
| 1271.0 | 9.88 |
| 1272.0 | 9.88 |
| 1273.0 | 9.882 |
| 1274.0 | 9.879 |
| 1275.0 | 9.882 |
| 1276.0 | 9.892 |
| 1277.0 | 9.883 |
| 1278.0 | 9.87 |
| 1279.0 | 9.88 |
| 1280.0 | 9.885 |
| 1281.0 | 9.889 |
| 1282.0 | 9.877 |
| 1283.0 | 9.874 |
| 1284.0 | 9.892 |
| 1285.0 | 9.893 |
| 1286.0 | 9.885 |
| 1287.0 | 9.879 |
| 1288.0 | 9.884 |
| 1289.0 | 9.888 |
| 1290.0 | 9.89 |
| 1291.0 | 9.877 |
| 1292.0 | 9.883 |
| 1293.0 | 9.897 |
| 1294.0 | 9.894 |
| 1295.0 | 9.889 |
| 1296.0 | 9.888 |
| 1297.0 | 9.899 |
| 1298.0 | 9.894 |
| 1299.0 | 9.884 |
| 1300.0 | 9.891 |
| 1301.0 | 9.897 |
| 1302.0 | 9.891 |
| 1303.0 | 9.891 |
| 1304.0 | 9.888 |
| 1305.0 | 9.89 |
| 1306.0 | 9.907 |
| 1307.0 | 9.894 |
| 1308.0 | 9.883 |
| 1309.0 | 9.892 |
| 1310.0 | 9.904 |
| 1311.0 | 9.889 |
| 1312.0 | 9.894 |
| 1313.0 | 9.9 |
| 1314.0 | 9.907 |
| 1315.0 | 9.89 |
| 1316.0 | 9.889 |
| 1317.0 | 9.892 |
| 1318.0 | 9.907 |
| 1319.0 | 9.889 |
| 1320.0 | 9.886 |
| 1321.0 | 9.898 |
| 1322.0 | 9.904 |
| 1323.0 | 9.9 |
| 1324.0 | 9.886 |
| 1325.0 | 9.894 |
| 1326.0 | 9.9 |
| 1327.0 | 9.904 |
| 1328.0 | 9.897 |
| 1329.0 | 9.897 |
| 1330.0 | 9.909 |
| 1331.0 | 9.904 |
| 1332.0 | 9.889 |
| 1333.0 | 9.891 |
| 1334.0 | 9.912 |
| 1335.0 | 9.905 |
| 1336.0 | 9.895 |
| 1337.0 | 9.9 |
| 1338.0 | 9.904 |
| 1339.0 | 9.909 |
| 1340.0 | 9.895 |
| 1341.0 | 9.902 |
| 1342.0 | 9.907 |
| 1343.0 | 9.907 |
| 1344.0 | 9.901 |
| 1345.0 | 9.897 |
| 1346.0 | 9.901 |
| 1347.0 | 9.915 |
| 1348.0 | 9.907 |
| 1349.0 | 9.893 |
| 1350.0 | 9.898 |
| 1351.0 | 9.909 |
| 1352.0 | 9.915 |
| 1353.0 | 9.903 |
| 1354.0 | 9.901 |
| 1355.0 | 9.901 |
| 1356.0 | 9.912 |
| 1357.0 | 9.905 |
| 1358.0 | 9.902 |
| 1359.0 | 9.902 |
| 1360.0 | 9.904 |
| 1361.0 | 9.916 |
| 1362.0 | 9.902 |
| 1363.0 | 9.905 |
| 1364.0 | 9.895 |
| 1365.0 | 9.914 |
| 1366.0 | 9.909 |
| 1367.0 | 9.899 |
| 1368.0 | 9.899 |
| 1369.0 | 9.903 |
| 1370.0 | 9.911 |
| 1371.0 | 9.916 |
| 1372.0 | 9.903 |
| 1373.0 | 9.905 |
| 1374.0 | 9.906 |
| 1375.0 | 9.923 |
| 1376.0 | 9.911 |
| 1377.0 | 9.905 |
| 1378.0 | 9.901 |
| 1379.0 | 9.902 |
| 1380.0 | 9.915 |
| 1381.0 | 9.92 |
| 1382.0 | 9.91 |
| 1383.0 | 9.898 |
| 1384.0 | 9.909 |
| 1385.0 | 9.922 |
| 1386.0 | 9.907 |
| 1387.0 | 9.902 |
| 1388.0 | 9.907 |
| 1389.0 | 9.915 |
| 1390.0 | 9.917 |
| 1391.0 | 9.907 |
| 1392.0 | 9.906 |
| 1393.0 | 9.911 |
| 1394.0 | 9.925 |
| 1395.0 | 9.91 |
| 1396.0 | 9.905 |
| 1397.0 | 9.894 |
| 1398.0 | 9.911 |
| 1399.0 | 9.923 |
| 1400.0 | 9.916 |
| 1401.0 | 9.904 |
| 1402.0 | 9.908 |
| 1403.0 | 9.915 |
| 1404.0 | 9.915 |
| 1405.0 | 9.912 |
| 1406.0 | 9.9 |
| 1407.0 | 9.908 |
| 1408.0 | 9.929 |
| 1409.0 | 9.923 |
| 1410.0 | 9.915 |
| 1411.0 | 9.917 |
| 1412.0 | 9.914 |
| 1413.0 | 9.924 |
| 1414.0 | 9.918 |
| 1415.0 | 9.912 |
| 1416.0 | 9.913 |
| 1417.0 | 9.917 |
| 1418.0 | 9.921 |
| 1419.0 | 9.906 |
| 1420.0 | 9.911 |
| 1421.0 | 9.914 |
| 1422.0 | 9.926 |
| 1423.0 | 9.917 |
| 1424.0 | 9.917 |
| 1425.0 | 9.917 |
| 1426.0 | 9.915 |
| 1427.0 | 9.931 |
| 1428.0 | 9.925 |
| 1429.0 | 9.915 |
| 1430.0 | 9.92 |
| 1431.0 | 9.92 |
| 1432.0 | 9.922 |
| 1433.0 | 9.908 |
| 1434.0 | 9.914 |
| 1435.0 | 9.925 |
| 1436.0 | 9.933 |
| 1437.0 | 9.934 |
| 1438.0 | 9.92 |
| 1439.0 | 9.929 |
| 1440.0 | 9.93 |
| 1441.0 | 9.921 |
| 1442.0 | 9.918 |
| 1443.0 | 9.925 |
| 1444.0 | 9.924 |
| 1445.0 | 9.926 |
| 1446.0 | 9.917 |
| 1447.0 | 9.92 |
| 1448.0 | 9.927 |
| 1449.0 | 9.938 |
| 1450.0 | 9.924 |
| 1451.0 | 9.92 |
| 1452.0 | 9.935 |
| 1453.0 | 9.934 |
| 1454.0 | 9.933 |
| 1455.0 | 9.921 |
| 1456.0 | 9.929 |
| 1457.0 | 9.944 |
| 1458.0 | 9.935 |
| 1459.0 | 9.925 |
| 1460.0 | 9.922 |
| 1461.0 | 9.938 |
| 1462.0 | 9.943 |
| 1463.0 | 9.931 |
| 1464.0 | 9.937 |
| 1465.0 | 9.929 |
| 1466.0 | 9.936 |
| 1467.0 | 9.937 |
| 1468.0 | 9.929 |
| 1469.0 | 9.929 |
| 1470.0 | 9.94 |
| 1471.0 | 9.944 |
| 1472.0 | 9.937 |
| 1473.0 | 9.927 |
| 1474.0 | 9.934 |
| 1475.0 | 9.947 |
| 1476.0 | 9.939 |
| 1477.0 | 9.928 |
| 1478.0 | 9.933 |
| 1479.0 | 9.93 |
| 1480.0 | 9.942 |
| 1481.0 | 9.94 |
| 1482.0 | 9.931 |
| 1483.0 | 9.938 |
| 1484.0 | 9.944 |
| 1485.0 | 9.937 |
| 1486.0 | 9.94 |
| 1487.0 | 9.931 |
| 1488.0 | 9.939 |
| 1489.0 | 9.944 |
| 1490.0 | 9.935 |
| 1491.0 | 9.934 |
| 1492.0 | 9.941 |
| 1493.0 | 9.937 |
| 1494.0 | 9.941 |
| 1495.0 | 9.939 |
| 1496.0 | 9.938 |
| 1497.0 | 9.931 |
| 1498.0 | 9.951 |
| 1499.0 | 9.944 |
| 1500.0 | 9.932 |
| 1501.0 | 9.932 |
| 1502.0 | 9.947 |
| 1503.0 | 9.952 |
| 1504.0 | 9.935 |
| 1505.0 | 9.929 |
| 1506.0 | 9.942 |
| 1507.0 | 9.951 |
| 1508.0 | 9.939 |
| 1509.0 | 9.94 |
| 1510.0 | 9.937 |
| 1511.0 | 9.95 |
| 1512.0 | 9.949 |
| 1513.0 | 9.94 |
| 1514.0 | 9.938 |
| 1515.0 | 9.948 |
| 1516.0 | 9.946 |
| 1517.0 | 9.945 |
| 1518.0 | 9.934 |
| 1519.0 | 9.941 |
| 1520.0 | 9.952 |
| 1521.0 | 9.95 |
| 1522.0 | 9.94 |
| 1523.0 | 9.939 |
| 1524.0 | 9.949 |
| 1525.0 | 9.958 |
| 1526.0 | 9.946 |
| 1527.0 | 9.936 |
| 1528.0 | 9.944 |
| 1529.0 | 9.95 |
| 1530.0 | 9.95 |
| 1531.0 | 9.942 |
| 1532.0 | 9.943 |
| 1533.0 | 9.962 |
| 1534.0 | 9.955 |
| 1535.0 | 9.943 |
| 1536.0 | 9.949 |
| 1537.0 | 9.951 |
| 1538.0 | 9.958 |
| 1539.0 | 9.951 |
| 1540.0 | 9.94 |
| 1541.0 | 9.941 |
| 1542.0 | 9.961 |
| 1543.0 | 9.959 |
| 1544.0 | 9.956 |
| 1545.0 | 9.943 |
| 1546.0 | 9.951 |
| 1547.0 | 9.953 |
| 1548.0 | 9.951 |
| 1549.0 | 9.948 |
| 1550.0 | 9.954 |
| 1551.0 | 9.963 |
| 1552.0 | 9.967 |
| 1553.0 | 9.949 |
| 1554.0 | 9.952 |
| 1555.0 | 9.956 |
| 1556.0 | 9.962 |
| 1557.0 | 9.96 |
| 1558.0 | 9.95 |
| 1559.0 | 9.964 |
| 1560.0 | 9.968 |
| 1561.0 | 9.956 |
| 1562.0 | 9.959 |
| 1563.0 | 9.948 |
| 1564.0 | 9.962 |
| 1565.0 | 9.96 |
| 1566.0 | 9.95 |
| 1567.0 | 9.954 |
| 1568.0 | 9.961 |
| 1569.0 | 9.966 |
| 1570.0 | 9.96 |
| 1571.0 | 9.956 |
| 1572.0 | 9.961 |
| 1573.0 | 9.96 |
| 1574.0 | 9.959 |
| 1575.0 | 9.955 |
| 1576.0 | 9.955 |
| 1577.0 | 9.968 |
| 1578.0 | 9.969 |
| 1579.0 | 9.954 |
| 1580.0 | 9.952 |
| 1581.0 | 9.966 |
| 1582.0 | 9.966 |
| 1583.0 | 9.961 |
| 1584.0 | 9.961 |
| 1585.0 | 9.965 |
| 1586.0 | 9.973 |
| 1587.0 | 9.966 |
| 1588.0 | 9.959 |
| 1589.0 | 9.958 |
| 1590.0 | 9.974 |
| 1591.0 | 9.966 |
| 1592.0 | 9.958 |
| 1593.0 | 9.957 |
| 1594.0 | 9.968 |
| 1595.0 | 9.974 |
| 1596.0 | 9.968 |
| 1597.0 | 9.951 |
| 1598.0 | 9.967 |
| 1599.0 | 9.971 |
| 1600.0 | 9.96 |
| 1601.0 | 9.953 |
| 1602.0 | 9.97 |
| 1603.0 | 9.966 |
| 1604.0 | 9.971 |
| 1605.0 | 9.965 |
| 1606.0 | 9.968 |
| 1607.0 | 9.968 |
| 1608.0 | 9.971 |
| 1609.0 | 9.962 |
| 1610.0 | 9.958 |
| 1611.0 | 9.975 |
| 1612.0 | 9.979 |
| 1613.0 | 9.962 |
| 1614.0 | 9.966 |
| 1615.0 | 9.975 |
| 1616.0 | 9.973 |
| 1617.0 | 9.964 |
| 1618.0 | 9.961 |
| 1619.0 | 9.977 |
| 1620.0 | 9.983 |
| 1621.0 | 9.969 |
| 1622.0 | 9.968 |
| 1623.0 | 9.976 |
| 1624.0 | 9.975 |
| 1625.0 | 9.977 |
| 1626.0 | 9.967 |
| 1627.0 | 9.981 |
| 1628.0 | 9.984 |
| 1629.0 | 9.968 |
| 1630.0 | 9.968 |
| 1631.0 | 9.974 |
| 1632.0 | 9.979 |
| 1633.0 | 9.985 |
| 1634.0 | 9.972 |
| 1635.0 | 9.978 |
| 1636.0 | 9.983 |
| 1637.0 | 9.984 |
| 1638.0 | 9.968 |
| 1639.0 | 9.975 |
| 1640.0 | 9.992 |
| 1641.0 | 9.987 |
| 1642.0 | 9.983 |
| 1643.0 | 9.972 |
| 1644.0 | 9.98 |
| 1645.0 | 9.985 |
| 1646.0 | 9.969 |
| 1647.0 | 9.979 |
| 1648.0 | 9.978 |
| 1649.0 | 9.988 |
| 1650.0 | 9.983 |
| 1651.0 | 9.972 |
| 1652.0 | 9.974 |
| 1653.0 | 9.992 |
| 1654.0 | 9.982 |
| 1655.0 | 9.985 |
| 1656.0 | 9.983 |
| 1657.0 | 9.984 |
| 1658.0 | 9.991 |
| 1659.0 | 9.975 |
| 1660.0 | 9.977 |
| 1661.0 | 9.976 |
| 1662.0 | 9.989 |
| 1663.0 | 9.977 |
| 1664.0 | 9.976 |
| 1665.0 | 9.979 |
| 1666.0 | 9.986 |
| 1667.0 | 9.995 |
| 1668.0 | 9.978 |
| 1669.0 | 9.99 |
| 1670.0 | 9.986 |
| 1671.0 | 9.992 |
| 1672.0 | 9.981 |
| 1673.0 | 9.986 |
| 1674.0 | 9.985 |
| 1675.0 | 9.99 |
| 1676.0 | 9.992 |
| 1677.0 | 9.977 |
| 1678.0 | 9.993 |
| 1679.0 | 9.993 |
| 1680.0 | 9.989 |
| 1681.0 | 9.985 |
| 1682.0 | 9.989 |
| 1683.0 | 9.994 |
| 1684.0 | 9.987 |
| 1685.0 | 9.987 |
| 1686.0 | 9.992 |
| 1687.0 | 9.999 |
| 1688.0 | 9.989 |
| 1689.0 | 9.978 |
| 1690.0 | 9.99 |
| 1691.0 | 9.996 |
| 1692.0 | 9.996 |
| 1693.0 | 9.984 |
| 1694.0 | 9.988 |
| 1695.0 | 9.994 |
| 1696.0 | 9.996 |
| 1697.0 | 9.99 |
| 1698.0 | 9.984 |
| 1699.0 | 9.987 |
| 1700.0 | 9.998 |
| 1701.0 | 9.996 |
| 1702.0 | 9.987 |
| 1703.0 | 9.989 |
| 1704.0 | 10 |
| 1705.0 | 9.996 |
| 1706.0 | 9.99 |
| 1707.0 | 9.985 |
| 1708.0 | 9.997 |
| 1709.0 | 9.999 |
| 1710.0 | 9.987 |
| 1711.0 | 9.981 |
| 1712.0 | 9.996 |
| 1713.0 | 9.999 |
| 1714.0 | 9.996 |
| 1715.0 | 9.985 |
| 1716.0 | 9.999 |
| 1717.0 | 10.004 |
| 1718.0 | 9.995 |
| 1719.0 | 9.988 |
| 1720.0 | 9.991 |
| 1721.0 | 10.006 |
| 1722.0 | 10.003 |
| 1723.0 | 9.991 |
| 1724.0 | 9.987 |
| 1725.0 | 9.993 |
| 1726.0 | 10.007 |
| 1727.0 | 10.006 |
| 1728.0 | 9.988 |
| 1729.0 | 9.995 |
| 1730.0 | 9.99 |
| 1731.0 | 10 |
| 1732.0 | 9.993 |
| 1733.0 | 9.994 |
| 1734.0 | 10.005 |
| 1735.0 | 10.009 |
| 1736.0 | 9.992 |
| 1737.0 | 9.992 |
| 1738.0 | 9.999 |
| 1739.0 | 10.01 |
| 1740.0 | 10.002 |
| 1741.0 | 9.99 |
| 1742.0 | 10.002 |
| 1743.0 | 10 |
| 1744.0 | 9.995 |
| 1745.0 | 10.001 |
| 1746.0 | 10.002 |
| 1747.0 | 10.005 |
| 1748.0 | 10 |
| 1749.0 | 9.992 |
| 1750.0 | 10.009 |
| 1751.0 | 10.01 |
| 1752.0 | 10.009 |
| 1753.0 | 9.997 |
| 1754.0 | 9.996 |
| 1755.0 | 10.007 |
| 1756.0 | 10.009 |
| 1757.0 | 9.998 |
| 1758.0 | 10.006 |
| 1759.0 | 10.003 |
| 1760.0 | 10.014 |
| 1761.0 | 10.001 |
| 1762.0 | 10.006 |
| 1763.0 | 10.008 |
| 1764.0 | 10.012 |
| 1765.0 | 10.009 |
| 1766.0 | 9.998 |
| 1767.0 | 10.006 |
| 1768.0 | 10.013 |
| 1769.0 | 10.013 |
| 1770.0 | 10.001 |
| 1771.0 | 10.01 |
| 1772.0 | 10.011 |
| 1773.0 | 10.013 |
| 1774.0 | 10 |
| 1775.0 | 10.009 |
| 1776.0 | 10.025 |
| 1777.0 | 10.013 |
| 1778.0 | 9.999 |
| 1779.0 | 10.008 |
| 1780.0 | 10.014 |
| 1781.0 | 10.018 |
| 1782.0 | 10.009 |
| 1783.0 | 10.005 |
| 1784.0 | 10.012 |
| 1785.0 | 10.015 |
| 1786.0 | 10.014 |
| 1787.0 | 10.009 |
| 1788.0 | 10.009 |
| 1789.0 | 10.014 |
| 1790.0 | 10.011 |
| 1791.0 | 10.01 |
| 1792.0 | 10.007 |
| 1793.0 | 10.015 |
| 1794.0 | 10.015 |
| 1795.0 | 10.017 |
| 1796.0 | 10.006 |
| 1797.0 | 10.008 |
| 1798.0 | 10.018 |
| 1799.0 | 10.012 |
| 1800.0 | 10.009 |
| 1801.0 | 10.005 |
| 1802.0 | 10.021 |
| 1803.0 | 10.017 |
| 1804.0 | 10.01 |
| 1805.0 | 10.006 |
| 1806.0 | 10.008 |
| 1807.0 | 10.018 |
| 1808.0 | 10.021 |
| 1809.0 | 10.004 |
| 1810.0 | 10.01 |
| 1811.0 | 10.017 |
| 1812.0 | 10.017 |
| 1813.0 | 10.012 |
| 1814.0 | 10.009 |
| 1815.0 | 10.018 |
| 1816.0 | 10.036 |
| 1817.0 | 10.016 |
| 1818.0 | 10.007 |
| 1819.0 | 10.012 |
| 1820.0 | 10.021 |
| 1821.0 | 10.027 |
| 1822.0 | 10.014 |
| 1823.0 | 10.017 |
| 1824.0 | 10.026 |
| 1825.0 | 10.023 |
| 1826.0 | 10.011 |
| 1827.0 | 10.009 |
| 1828.0 | 10.024 |
| 1829.0 | 10.029 |
| 1830.0 | 10.009 |
| 1831.0 | 10.014 |
| 1832.0 | 10.022 |
| 1833.0 | 10.033 |
| 1834.0 | 10.017 |
| 1835.0 | 10.014 |
| 1836.0 | 10.015 |
| 1837.0 | 10.03 |
| 1838.0 | 10.03 |
| 1839.0 | 10.019 |
| 1840.0 | 10.015 |
| 1841.0 | 10.02 |
| 1842.0 | 10.023 |
| 1843.0 | 10.018 |
| 1844.0 | 10.013 |
| 1845.0 | 10.025 |
| 1846.0 | 10.029 |
| 1847.0 | 10.016 |
| 1848.0 | 10.013 |
| 1849.0 | 10.015 |
| 1850.0 | 10.031 |
| 1851.0 | 10.026 |
| 1852.0 | 10.014 |
| 1853.0 | 10.021 |
| 1854.0 | 10.023 |
| 1855.0 | 10.029 |
| 1856.0 | 10.029 |
| 1857.0 | 10.007 |
| 1858.0 | 10.02 |
| 1859.0 | 10.027 |
| 1860.0 | 10.028 |
| 1861.0 | 10.022 |
| 1862.0 | 10.02 |
| 1863.0 | 10.027 |
| 1864.0 | 10.026 |
| 1865.0 | 10.026 |
| 1866.0 | 10.026 |
| 1867.0 | 10.034 |
| 1868.0 | 10.035 |
| 1869.0 | 10.026 |
| 1870.0 | 10.025 |
| 1871.0 | 10.034 |
| 1872.0 | 10.029 |
| 1873.0 | 10.026 |
| 1874.0 | 10.024 |
| 1875.0 | 10.033 |
| 1876.0 | 10.036 |
| 1877.0 | 10.026 |
| 1878.0 | 10.016 |
| 1879.0 | 10.031 |
| 1880.0 | 10.04 |
| 1881.0 | 10.038 |
| 1882.0 | 10.021 |
| 1883.0 | 10.02 |
| 1884.0 | 10.029 |
| 1885.0 | 10.034 |
| 1886.0 | 10.032 |
| 1887.0 | 10.029 |
| 1888.0 | 10.023 |
| 1889.0 | 10.038 |
| 1890.0 | 10.026 |
| 1891.0 | 10.029 |
| 1892.0 | 10.023 |
| 1893.0 | 10.035 |
| 1894.0 | 10.029 |
| 1895.0 | 10.033 |
| 1896.0 | 10.028 |
| 1897.0 | 10.036 |
| 1898.0 | 10.042 |
| 1899.0 | 10.035 |
| 1900.0 | 10.031 |
| 1901.0 | 10.027 |
| 1902.0 | 10.035 |
| 1903.0 | 10.045 |
| 1904.0 | 10.029 |
| 1905.0 | 10.028 |
| 1906.0 | 10.033 |
| 1907.0 | 10.043 |
| 1908.0 | 10.045 |
| 1909.0 | 10.026 |
| 1910.0 | 10.028 |
| 1911.0 | 10.036 |
| 1912.0 | 10.05 |
| 1913.0 | 10.027 |
| 1914.0 | 10.036 |
| 1915.0 | 10.039 |
| 1916.0 | 10.045 |
| 1917.0 | 10.029 |
| 1918.0 | 10.029 |
| 1919.0 | 10.024 |
| 1920.0 | 10.041 |
| 1921.0 | 10.042 |
| 1922.0 | 10.033 |
| 1923.0 | 10.032 |
| 1924.0 | 10.043 |
| 1925.0 | 10.042 |
| 1926.0 | 10.039 |
| 1927.0 | 10.029 |
| 1928.0 | 10.033 |
| 1929.0 | 10.046 |
| 1930.0 | 10.037 |
| 1931.0 | 10.031 |
| 1932.0 | 10.04 |
| 1933.0 | 10.045 |
| 1934.0 | 10.042 |
| 1935.0 | 10.029 |
| 1936.0 | 10.037 |
| 1937.0 | 10.046 |
| 1938.0 | 10.043 |
| 1939.0 | 10.037 |
| 1940.0 | 10.028 |
| 1941.0 | 10.043 |
| 1942.0 | 10.054 |
| 1943.0 | 10.03 |
| 1944.0 | 10.036 |
| 1945.0 | 10.037 |
| 1946.0 | 10.051 |
| 1947.0 | 10.038 |
| 1948.0 | 10.038 |
| 1949.0 | 10.038 |
| 1950.0 | 10.052 |
| 1951.0 | 10.042 |
| 1952.0 | 10.034 |
| 1953.0 | 10.046 |
| 1954.0 | 10.052 |
| 1955.0 | 10.047 |
| 1956.0 | 10.045 |
| 1957.0 | 10.04 |
| 1958.0 | 10.043 |
| 1959.0 | 10.051 |
| 1960.0 | 10.041 |
| 1961.0 | 10.038 |
| 1962.0 | 10.047 |
| 1963.0 | 10.05 |
| 1964.0 | 10.037 |
| 1965.0 | 10.031 |
| 1966.0 | 10.041 |
| 1967.0 | 10.051 |
| 1968.0 | 10.047 |
| 1969.0 | 10.036 |
| 1970.0 | 10.045 |
| 1971.0 | 10.058 |
| 1972.0 | 10.045 |
| 1973.0 | 10.042 |
| 1974.0 | 10.045 |
| 1975.0 | 10.055 |
| 1976.0 | 10.058 |
| 1977.0 | 10.041 |
| 1978.0 | 10.038 |
| 1979.0 | 10.045 |
| 1980.0 | 10.055 |
| 1981.0 | 10.05 |
| 1982.0 | 10.035 |
| 1983.0 | 10.041 |
| 1984.0 | 10.055 |
| 1985.0 | 10.062 |
| 1986.0 | 10.047 |
| 1987.0 | 10.046 |
| 1988.0 | 10.049 |
| 1989.0 | 10.064 |
| 1990.0 | 10.046 |
| 1991.0 | 10.046 |
| 1992.0 | 10.041 |
| 1993.0 | 10.056 |
| 1994.0 | 10.057 |
| 1995.0 | 10.039 |
| 1996.0 | 10.041 |
| 1997.0 | 10.049 |
| 1998.0 | 10.057 |
| 1999.0 | 10.053 |
| 2000.0 | 10.04 |
| 2001.0 | 10.048 |
| 2002.0 | 10.054 |
| 2003.0 | 10.055 |
| 2004.0 | 10.059 |
| 2005.0 | 10.042 |
| 2006.0 | 10.049 |
| 2007.0 | 10.069 |
| 2008.0 | 10.053 |
| 2009.0 | 10.044 |
| 2010.0 | 10.034 |
| 2011.0 | 10.05 |
| 2012.0 | 10.064 |
| 2013.0 | 10.052 |
| 2014.0 | 10.036 |
| 2015.0 | 10.046 |
| 2016.0 | 10.048 |
| 2017.0 | 10.059 |
| 2018.0 | 10.054 |
| 2019.0 | 10.045 |
| 2020.0 | 10.056 |
| 2021.0 | 10.053 |
| 2022.0 | 10.056 |
| 2023.0 | 10.045 |
| 2024.0 | 10.051 |
| 2025.0 | 10.062 |
| 2026.0 | 10.057 |
| 2027.0 | 10.044 |
| 2028.0 | 10.044 |
| 2029.0 | 10.065 |
| 2030.0 | 10.06 |
| 2031.0 | 10.049 |
| 2032.0 | 10.05 |
| 2033.0 | 10.054 |
| 2034.0 | 10.058 |
| 2035.0 | 10.058 |
| 2036.0 | 10.048 |
| 2037.0 | 10.052 |
| 2038.0 | 10.062 |
| 2039.0 | 10.061 |
| 2040.0 | 10.047 |
| 2041.0 | 10.045 |
| 2042.0 | 10.056 |
| 2043.0 | 10.059 |
| 2044.0 | 10.065 |
| 2045.0 | 10.047 |
| 2046.0 | 10.053 |
| 2047.0 | 10.065 |
| 2048.0 | 10.059 |
| 2049.0 | 10.06 |
| 2050.0 | 10.047 |
| 2051.0 | 10.068 |
| 2052.0 | 10.067 |
| 2053.0 | 10.055 |
| 2054.0 | 10.048 |
| 2055.0 | 10.059 |
| 2056.0 | 10.078 |
| 2057.0 | 10.065 |
| 2058.0 | 10.055 |
| 2059.0 | 10.059 |
| 2060.0 | 10.071 |
| 2061.0 | 10.064 |
| 2062.0 | 10.051 |
| 2063.0 | 10.05 |
| 2064.0 | 10.066 |
| 2065.0 | 10.062 |
| 2066.0 | 10.056 |
| 2067.0 | 10.051 |
| 2068.0 | 10.049 |
| 2069.0 | 10.07 |
| 2070.0 | 10.073 |
| 2071.0 | 10.065 |
| 2072.0 | 10.06 |
| 2073.0 | 10.061 |
| 2074.0 | 10.069 |
| 2075.0 | 10.061 |
| 2076.0 | 10.053 |
| 2077.0 | 10.056 |
| 2078.0 | 10.068 |
| 2079.0 | 10.072 |
| 2080.0 | 10.054 |
| 2081.0 | 10.052 |
| 2082.0 | 10.072 |
| 2083.0 | 10.073 |
| 2084.0 | 10.065 |
| 2085.0 | 10.056 |
| 2086.0 | 10.061 |
| 2087.0 | 10.069 |
| 2088.0 | 10.074 |
| 2089.0 | 10.055 |
| 2090.0 | 10.061 |
| 2091.0 | 10.06 |
| 2092.0 | 10.079 |
| 2093.0 | 10.052 |
| 2094.0 | 10.054 |
| 2095.0 | 10.075 |
| 2096.0 | 10.075 |
| 2097.0 | 10.07 |